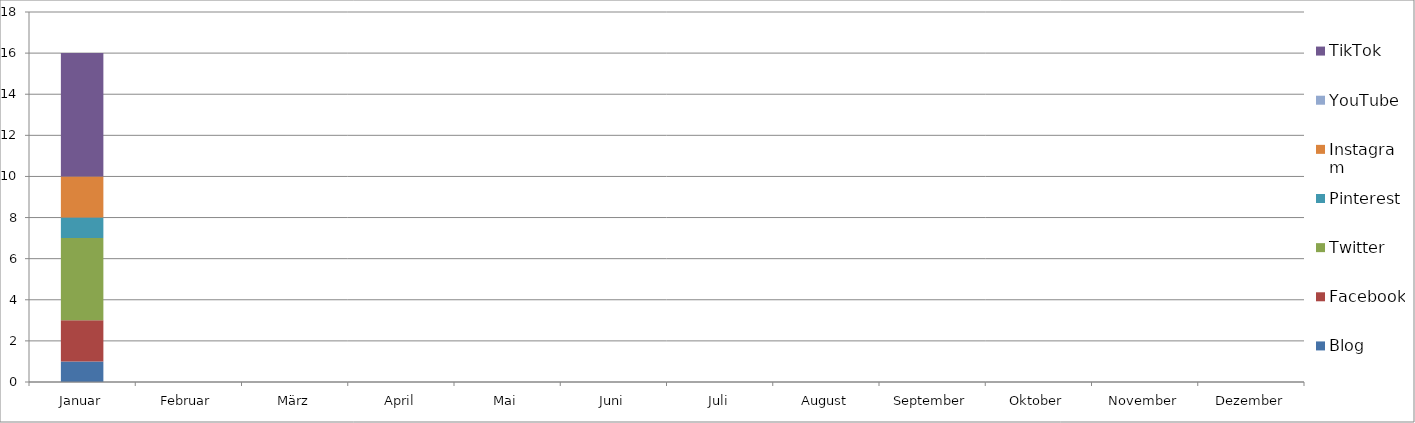
| Category | Blog | Facebook | Twitter  | Pinterest | Instagram | YouTube | TikTok |
|---|---|---|---|---|---|---|---|
| Januar | 1 | 2 | 4 | 1 | 2 | 0 | 6 |
| Februar | 0 | 0 | 0 | 0 | 0 | 0 | 0 |
| März | 0 | 0 | 0 | 0 | 0 | 0 | 0 |
| April | 0 | 0 | 0 | 0 | 0 | 0 | 0 |
| Mai | 0 | 0 | 0 | 0 | 0 | 0 | 0 |
| Juni | 0 | 0 | 0 | 0 | 0 | 0 | 0 |
| Juli | 0 | 0 | 0 | 0 | 0 | 0 | 0 |
| August | 0 | 0 | 0 | 0 | 0 | 0 | 0 |
| September | 0 | 0 | 0 | 0 | 0 | 0 | 0 |
| Oktober | 0 | 0 | 0 | 0 | 0 | 0 | 0 |
| November | 0 | 0 | 0 | 0 | 0 | 0 | 0 |
| Dezember | 0 | 0 | 0 | 0 | 0 | 0 | 0 |